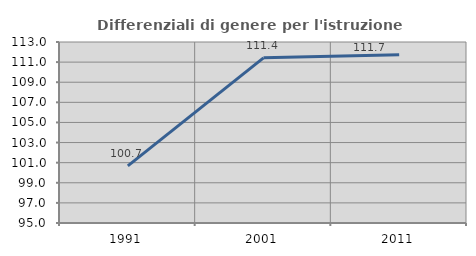
| Category | Differenziali di genere per l'istruzione superiore |
|---|---|
| 1991.0 | 100.677 |
| 2001.0 | 111.426 |
| 2011.0 | 111.724 |